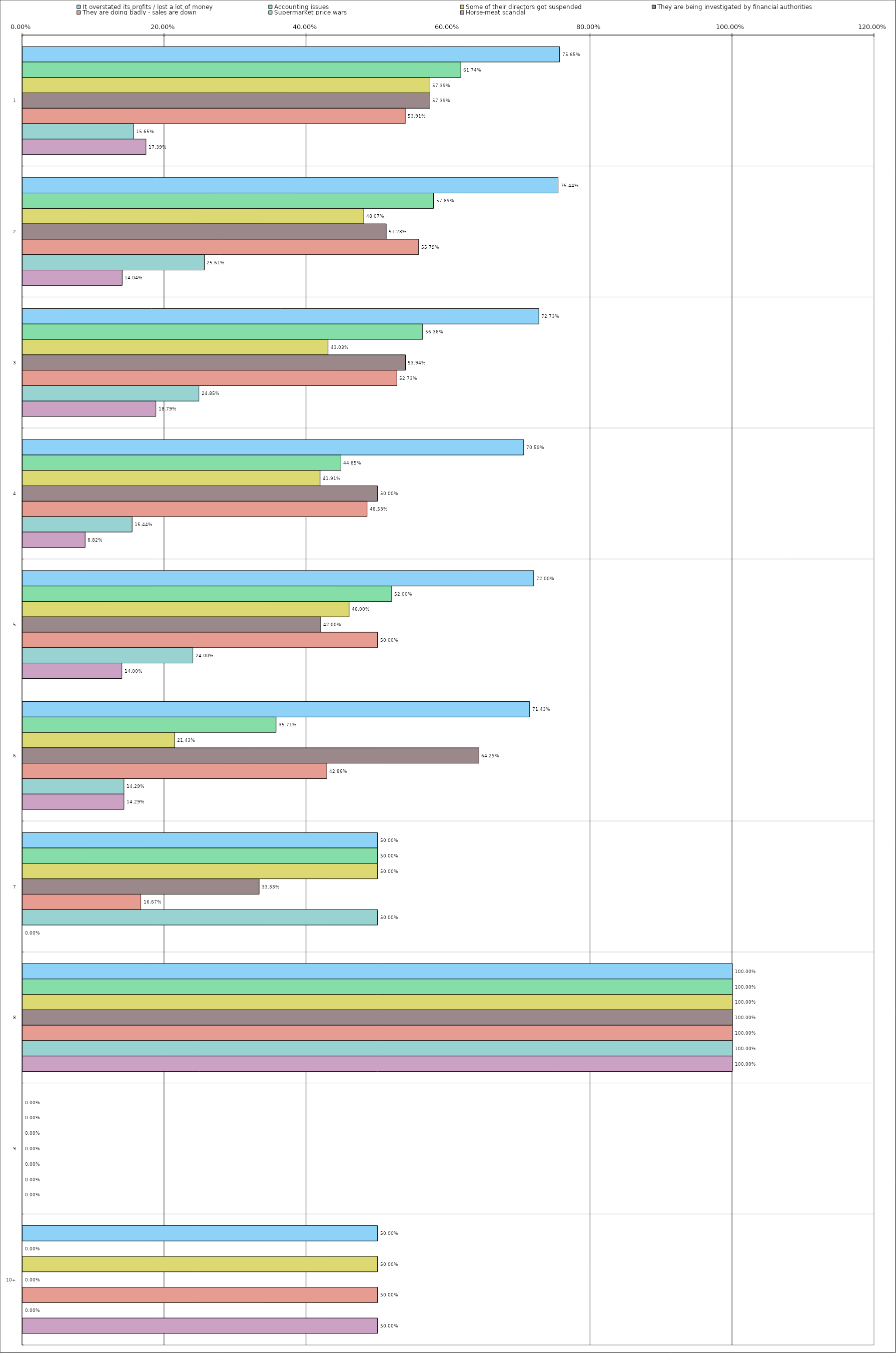
| Category | It overstated its profits / lost a lot of money | Accounting issues | Some of their directors got suspended | They are being investigated by financial authorities | They are doing badly - sales are down | Supermarket price wars | Horse-meat scandal |
|---|---|---|---|---|---|---|---|
| 0 | 0.756 | 0.617 | 0.574 | 0.574 | 0.539 | 0.156 | 0.174 |
| 1 | 0.754 | 0.579 | 0.481 | 0.512 | 0.558 | 0.256 | 0.14 |
| 2 | 0.727 | 0.564 | 0.43 | 0.539 | 0.527 | 0.248 | 0.188 |
| 3 | 0.706 | 0.448 | 0.419 | 0.5 | 0.485 | 0.154 | 0.088 |
| 4 | 0.72 | 0.52 | 0.46 | 0.42 | 0.5 | 0.24 | 0.14 |
| 5 | 0.714 | 0.357 | 0.214 | 0.643 | 0.429 | 0.143 | 0.143 |
| 6 | 0.5 | 0.5 | 0.5 | 0.333 | 0.167 | 0.5 | 0 |
| 7 | 1 | 1 | 1 | 1 | 1 | 1 | 1 |
| 8 | 0 | 0 | 0 | 0 | 0 | 0 | 0 |
| 9 | 0.5 | 0 | 0.5 | 0 | 0.5 | 0 | 0.5 |